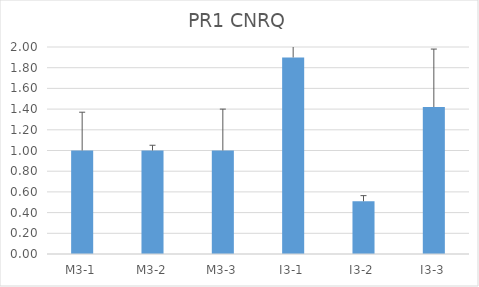
| Category | PR1 CNRQ |
|---|---|
| M3-1 | 1 |
| M3-2 | 1 |
| M3-3 | 1 |
| I3-1 | 1.899 |
| I3-2 | 0.509 |
| I3-3 | 1.42 |